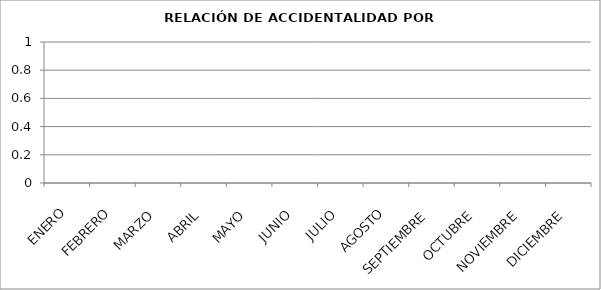
| Category | CANTIDAD |
|---|---|
| ENERO | 0 |
| FEBRERO | 0 |
| MARZO | 0 |
| ABRIL | 0 |
| MAYO | 0 |
| JUNIO | 0 |
| JULIO | 0 |
| AGOSTO | 0 |
| SEPTIEMBRE | 0 |
| OCTUBRE | 0 |
| NOVIEMBRE | 0 |
| DICIEMBRE | 0 |